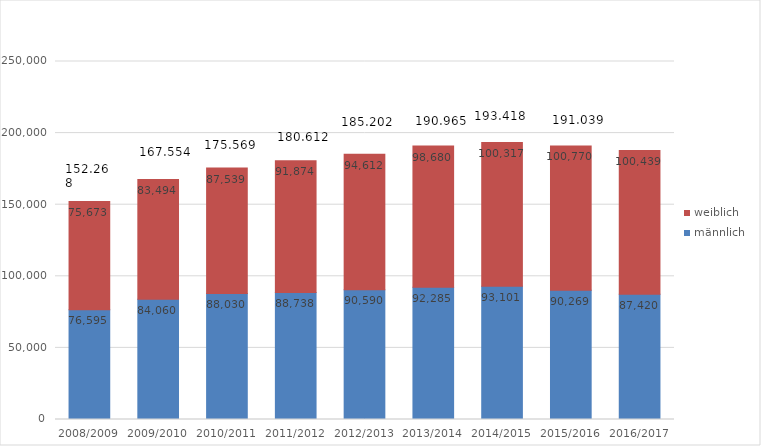
| Category | männlich | weiblich |
|---|---|---|
| 2008/2009 | 76595 | 75673 |
| 2009/2010 | 84060 | 83494 |
| 2010/2011 | 88030 | 87539 |
| 2011/2012 | 88738 | 91874 |
| 2012/2013 | 90590 | 94612 |
| 2013/2014 | 92285 | 98680 |
| 2014/2015 | 93101 | 100317 |
| 2015/2016 | 90269 | 100770 |
| 2016/2017 | 87420 | 100439 |